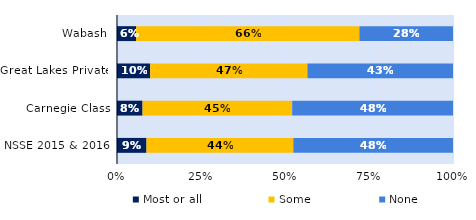
| Category | Most or all | Some | None |
|---|---|---|---|
| Wabash | 0.057 | 0.664 | 0.279 |
| Great Lakes Private | 0.099 | 0.468 | 0.433 |
| Carnegie Class | 0.076 | 0.445 | 0.479 |
| NSSE 2015 & 2016 | 0.088 | 0.437 | 0.475 |